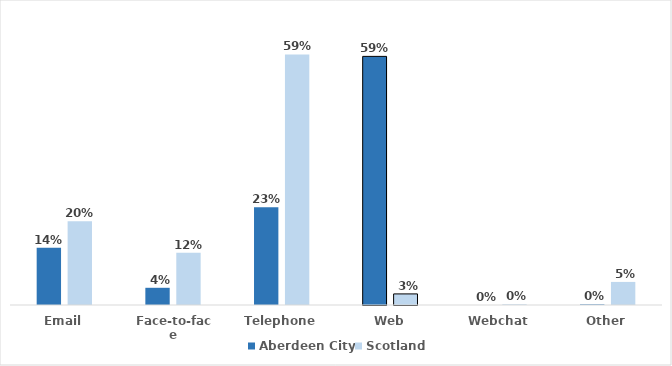
| Category | Aberdeen City | Scotland |
|---|---|---|
| Email | 0.136 | 0.199 |
| Face-to-face | 0.041 | 0.124 |
| Telephone | 0.232 | 0.595 |
| Web | 0.59 | 0.026 |
| Webchat | 0 | 0.002 |
| Other | 0.001 | 0.055 |